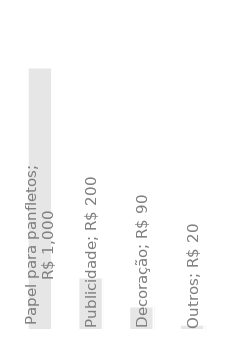
| Category | Despesas Anuais |
|---|---|
| Papel para panfletos | 1000 |
| Publicidade | 200 |
| Decoração | 90 |
| Outros | 20 |